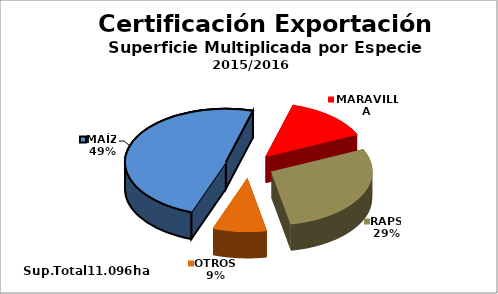
| Category | Series 0 |
|---|---|
| MAÍZ | 5413 |
| MARAVILLA | 1533 |
| RAPS | 3192 |
| OTROS | 958 |